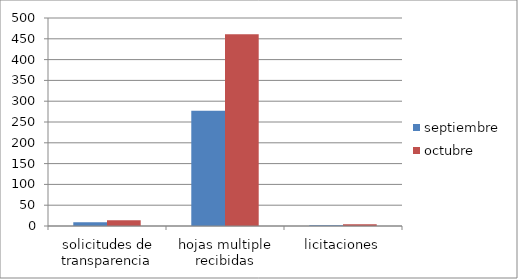
| Category | septiembre | octubre |
|---|---|---|
| solicitudes de transparencia | 9 | 14 |
| hojas multiple recibidas | 277 | 461 |
| licitaciones | 2 | 4 |